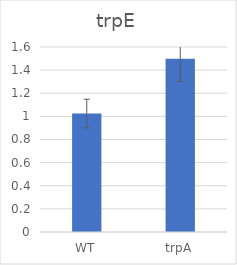
| Category | Series 0 |
|---|---|
| WT | 1.024 |
| trpA | 1.498 |